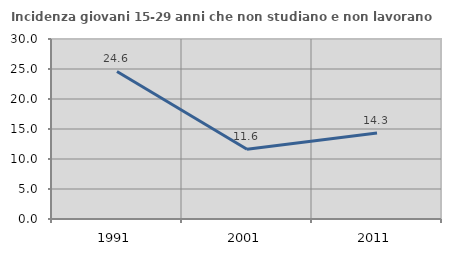
| Category | Incidenza giovani 15-29 anni che non studiano e non lavorano  |
|---|---|
| 1991.0 | 24.59 |
| 2001.0 | 11.628 |
| 2011.0 | 14.328 |